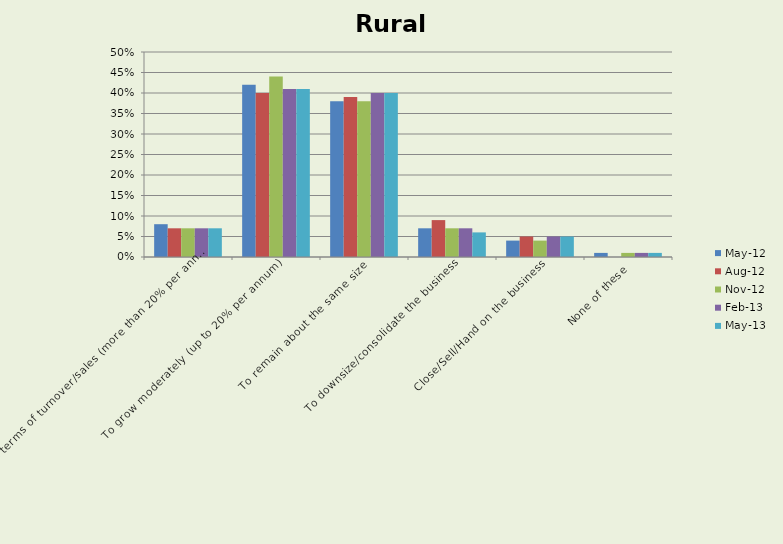
| Category | May-12 | Aug-12 | Nov-12 | Feb-13 | May-13 |
|---|---|---|---|---|---|
| To grow rapidly in terms of turnover/sales (more than 20% per annum) | 0.08 | 0.07 | 0.07 | 0.07 | 0.07 |
| To grow moderately (up to 20% per annum) | 0.42 | 0.4 | 0.44 | 0.41 | 0.41 |
| To remain about the same size | 0.38 | 0.39 | 0.38 | 0.4 | 0.4 |
| To downsize/consolidate the business | 0.07 | 0.09 | 0.07 | 0.07 | 0.06 |
| Close/Sell/Hand on the business | 0.04 | 0.05 | 0.04 | 0.05 | 0.05 |
| None of these | 0.01 | 0 | 0.01 | 0.01 | 0.01 |